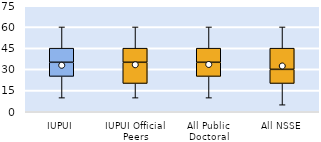
| Category | 25th | 50th | 75th |
|---|---|---|---|
| IUPUI | 25 | 10 | 10 |
| IUPUI Official Peers | 20 | 15 | 10 |
| All Public Doctoral | 25 | 10 | 10 |
| All NSSE | 20 | 10 | 15 |